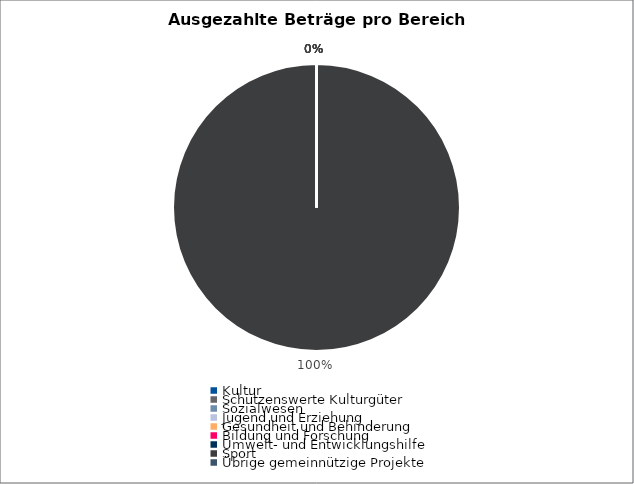
| Category | Series 0 |
|---|---|
| Kultur | 0 |
| Schützenswerte Kulturgüter | 0 |
| Sozialwesen | 0 |
| Jugend und Erziehung | 0 |
| Gesundheit und Behinderung | 0 |
| Bildung und Forschung | 0 |
| Umwelt- und Entwicklungshilfe | 0 |
| Sport | 28940005.31 |
| Übrige gemeinnützige Projekte | 0 |